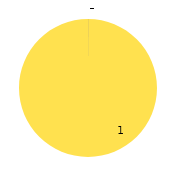
| Category | Friday | Department |
|---|---|---|
| 0 | 0 | 0 |
| 1 | 0 | 0 |
| 2 | 0 | 0 |
| 3 | 0 | 0 |
| 4 | 1 | 0 |
| 5 | 0 | 0 |
| 6 | 0 | 0 |
| 7 | 0 | 0 |
| 8 | 0 | 0 |
| 9 | 0 | 0 |
| 10 | 0 | 0 |
| 11 | 0 | 0 |
| 12 | 0 | 0 |
| 13 | 0 | 0 |
| 14 | 0 | 0 |
| 15 | 0 | 0 |
| 16 | 0 | 0 |
| 17 | 0 | 0 |
| 18 | 0 | 0 |
| 19 | 0 | 0 |